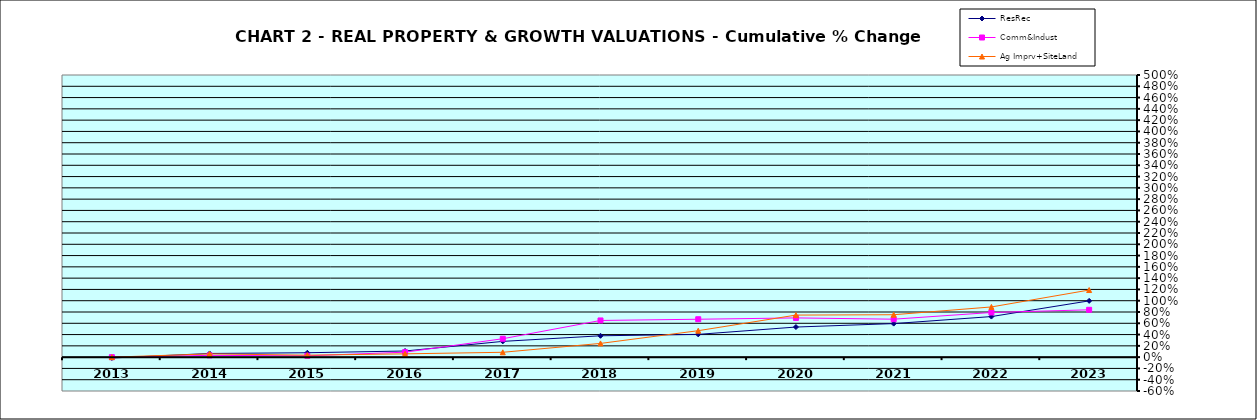
| Category | ResRec | Comm&Indust | Ag Imprv+SiteLand |
|---|---|---|---|
| 2013.0 | -0.015 | 0 | 0 |
| 2014.0 | 0.065 | 0.031 | 0.058 |
| 2015.0 | 0.078 | 0.024 | 0.035 |
| 2016.0 | 0.109 | 0.088 | 0.058 |
| 2017.0 | 0.279 | 0.326 | 0.086 |
| 2018.0 | 0.379 | 0.65 | 0.243 |
| 2019.0 | 0.404 | 0.672 | 0.469 |
| 2020.0 | 0.533 | 0.695 | 0.745 |
| 2021.0 | 0.594 | 0.672 | 0.752 |
| 2022.0 | 0.719 | 0.791 | 0.889 |
| 2023.0 | 0.997 | 0.839 | 1.189 |